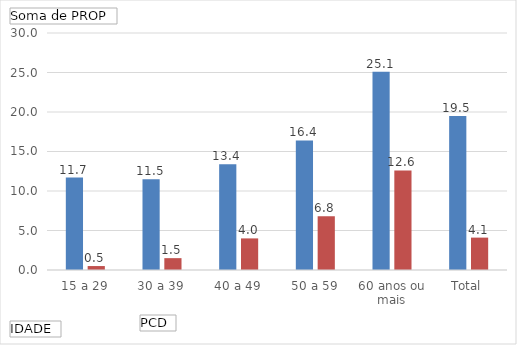
| Category | Com deficiência | Sem deficiência |
|---|---|---|
| 15 a 29 | 11.7 | 0.5 |
| 30 a 39 | 11.5 | 1.5 |
| 40 a 49 | 13.4 | 4 |
| 50 a 59 | 16.4 | 6.8 |
| 60 anos ou mais | 25.1 | 12.6 |
| Total | 19.5 | 4.1 |